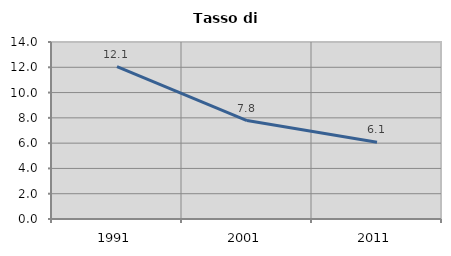
| Category | Tasso di disoccupazione   |
|---|---|
| 1991.0 | 12.053 |
| 2001.0 | 7.786 |
| 2011.0 | 6.065 |